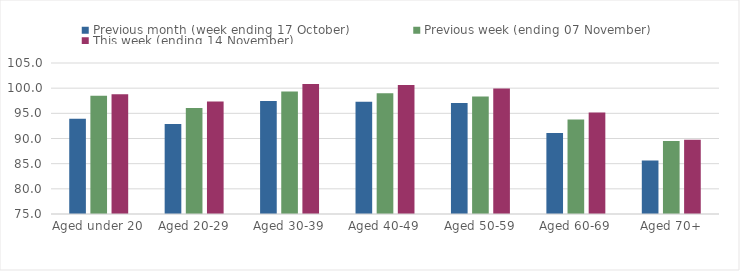
| Category | Previous month (week ending 17 October) | Previous week (ending 07 November) | This week (ending 14 November) |
|---|---|---|---|
| Aged under 20 | 93.93 | 98.48 | 98.79 |
| Aged 20-29 | 92.88 | 96.07 | 97.33 |
| Aged 30-39 | 97.44 | 99.32 | 100.84 |
| Aged 40-49 | 97.31 | 99 | 100.64 |
| Aged 50-59 | 97.06 | 98.34 | 99.92 |
| Aged 60-69 | 91.07 | 93.79 | 95.19 |
| Aged 70+ | 85.62 | 89.51 | 89.76 |